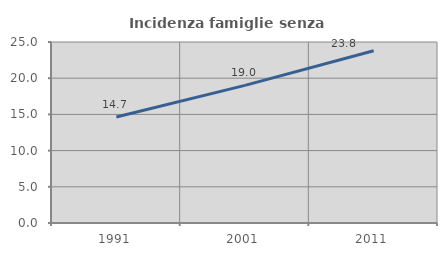
| Category | Incidenza famiglie senza nuclei |
|---|---|
| 1991.0 | 14.651 |
| 2001.0 | 19.005 |
| 2011.0 | 23.797 |